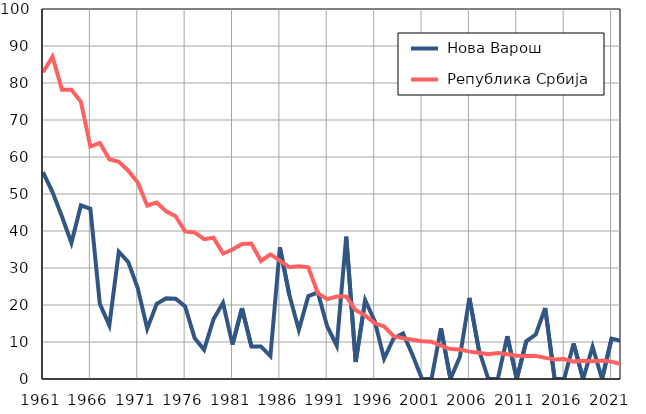
| Category |  Нова Варош |  Република Србија |
|---|---|---|
| 1961.0 | 55.9 | 82.9 |
| 1962.0 | 50.5 | 87.1 |
| 1963.0 | 43.9 | 78.2 |
| 1964.0 | 36.8 | 78.2 |
| 1965.0 | 46.9 | 74.9 |
| 1966.0 | 46 | 62.8 |
| 1967.0 | 20.3 | 63.8 |
| 1968.0 | 14.5 | 59.4 |
| 1969.0 | 34.4 | 58.7 |
| 1970.0 | 31.6 | 56.3 |
| 1971.0 | 24.6 | 53.1 |
| 1972.0 | 13.6 | 46.9 |
| 1973.0 | 20.3 | 47.7 |
| 1974.0 | 21.8 | 45.3 |
| 1975.0 | 21.7 | 44 |
| 1976.0 | 19.6 | 39.9 |
| 1977.0 | 11.1 | 39.6 |
| 1978.0 | 7.9 | 37.8 |
| 1979.0 | 16.2 | 38.2 |
| 1980.0 | 20.6 | 33.9 |
| 1981.0 | 9.3 | 35 |
| 1982.0 | 19.1 | 36.5 |
| 1983.0 | 8.8 | 36.6 |
| 1984.0 | 8.8 | 31.9 |
| 1985.0 | 6.2 | 33.7 |
| 1986.0 | 35.6 | 32 |
| 1987.0 | 22.7 | 30.2 |
| 1988.0 | 13.3 | 30.5 |
| 1989.0 | 22.4 | 30.2 |
| 1990.0 | 23.4 | 23.2 |
| 1991.0 | 14.2 | 21.6 |
| 1992.0 | 9 | 22.3 |
| 1993.0 | 38.5 | 22.3 |
| 1994.0 | 4.6 | 18.6 |
| 1995.0 | 21.3 | 17.2 |
| 1996.0 | 15.7 | 15.1 |
| 1997.0 | 5.5 | 14.2 |
| 1998.0 | 11 | 11.6 |
| 1999.0 | 12.3 | 11 |
| 2000.0 | 6.5 | 10.6 |
| 2001.0 | 0 | 10.2 |
| 2002.0 | 0 | 10.1 |
| 2003.0 | 13.7 | 9 |
| 2004.0 | 0 | 8.1 |
| 2005.0 | 6 | 8 |
| 2006.0 | 21.9 | 7.4 |
| 2007.0 | 7.9 | 7.1 |
| 2008.0 | 0 | 6.7 |
| 2009.0 | 0 | 7 |
| 2010.0 | 11.6 | 6.7 |
| 2011.0 | 0 | 6.3 |
| 2012.0 | 10.2 | 6.2 |
| 2013.0 | 12 | 6.3 |
| 2014.0 | 19.2 | 5.7 |
| 2015.0 | 0 | 5.3 |
| 2016.0 | 0 | 5.4 |
| 2017.0 | 9.6 | 4.7 |
| 2018.0 | 0 | 4.9 |
| 2019.0 | 8.7 | 4.8 |
| 2020.0 | 0 | 5 |
| 2021.0 | 10.9 | 4.7 |
| 2022.0 | 10.3 | 4 |